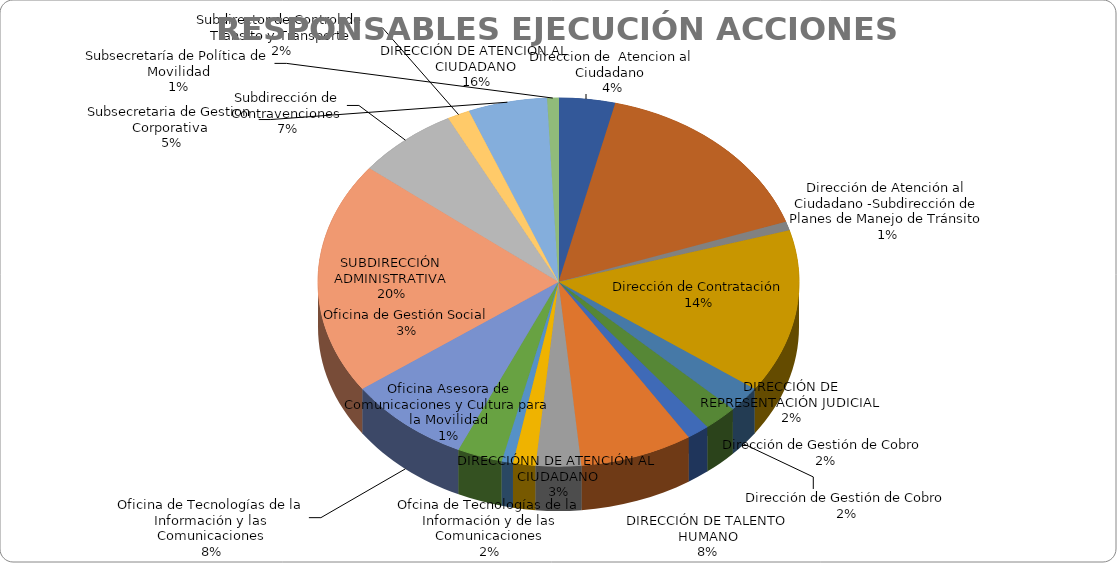
| Category | Total |
|---|---|
| Direccion de  Atencion al Ciudadano  | 5 |
| DIRECCIÓN DE ATENCIÓN AL CIUDADANO | 21 |
| Dirección de Atención al Ciudadano -Subdirección de Planes de Manejo de Tránsito | 1 |
| Dirección de Contratación | 19 |
| Dirección de Gestión de Cobro | 3 |
| Dirección de Gestión de Cobro  | 3 |
| DIRECCIÓN DE REPRESENTACIÓN JUDICIAL | 2 |
| DIRECCIÓN DE TALENTO HUMANO | 10 |
| DIRECCIÓNN DE ATENCIÓN AL CIUDADANO | 4 |
| Ofcina de Tecnologías de la Información y de las Comunicaciones | 2 |
| Oficina Asesora de Comunicaciones y Cultura para la Movilidad | 1 |
| Oficina de Gestión Social | 4 |
| Oficina de Tecnologías de la Información y las Comunicaciones | 11 |
| SUBDIRECCIÓN ADMINISTRATIVA | 27 |
| Subdirección de Contravenciones | 9 |
| Subdirector de Control de Tránsito y Transporte | 2 |
| Subsecretaria de Gestion Corporativa | 7 |
| Subsecretaría de Política de Movilidad | 1 |